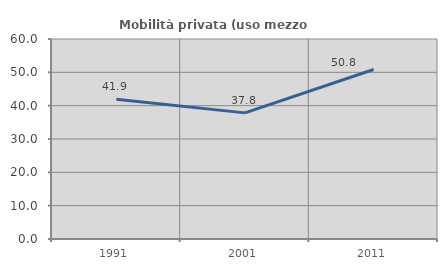
| Category | Mobilità privata (uso mezzo privato) |
|---|---|
| 1991.0 | 41.935 |
| 2001.0 | 37.838 |
| 2011.0 | 50.847 |